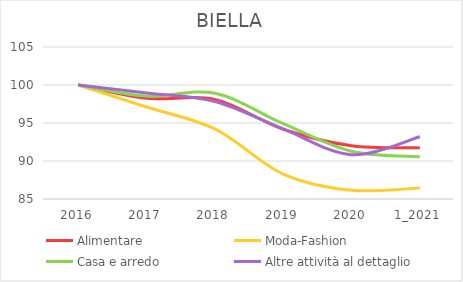
| Category | Alimentare | Moda-Fashion | Casa e arredo | Altre attività al dettaglio |
|---|---|---|---|---|
| 2016 | 100 | 100 | 100 | 100 |
| 2017 | 98.241 | 97.108 | 98.545 | 98.96 |
| 2018 | 98.106 | 94.216 | 98.909 | 97.826 |
| 2019 | 94.181 | 88.28 | 94.909 | 94.234 |
| 2020 | 92.016 | 86.149 | 91.273 | 90.832 |
| 1_2021 | 91.746 | 86.454 | 90.545 | 93.195 |